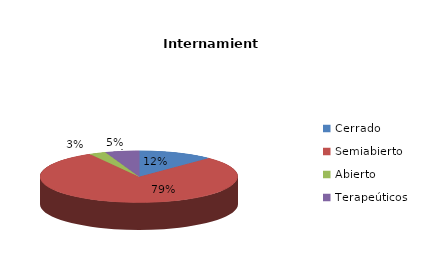
| Category | Series 0 |
|---|---|
| Cerrado | 9 |
| Semiabierto | 58 |
| Abierto | 2 |
| Terapeúticos | 4 |